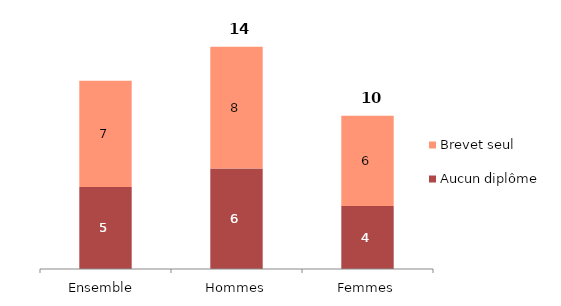
| Category | Aucun diplôme | Brevet seul |
|---|---|---|
| Ensemble  | 5.226 | 6.78 |
| Hommes | 6.403 | 7.769 |
| Femmes | 4.009 | 5.758 |